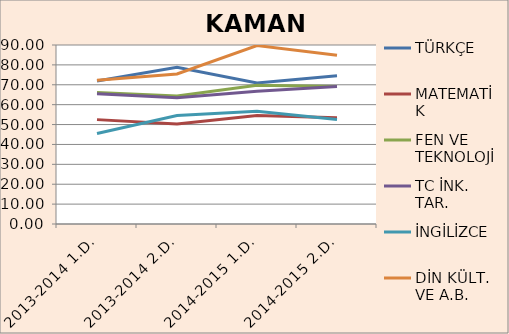
| Category | TÜRKÇE | MATEMATİK | FEN VE TEKNOLOJİ | TC İNK. TAR. | İNGİLİZCE | DİN KÜLT. VE A.B. |
|---|---|---|---|---|---|---|
| 2013-2014 1.D. | 71.86 | 52.48 | 66.07 | 65.44 | 45.52 | 72.31 |
| 2013-2014 2.D. | 78.85 | 50.31 | 64.35 | 63.54 | 54.54 | 75.46 |
| 2014-2015 1.D. | 70.93 | 54.52 | 69.79 | 66.69 | 56.66 | 89.72 |
| 2014-2015 2.D. | 74.49 | 53.46 | 69.18 | 69.08 | 52.5 | 84.79 |